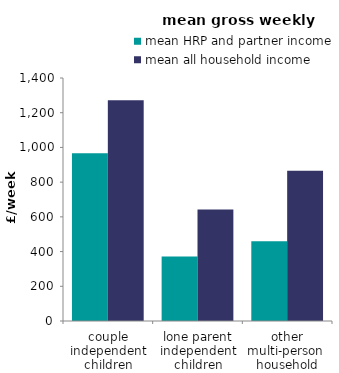
| Category | mean HRP and partner income  | mean all household income  |
|---|---|---|
| couple independent children | 966.702 | 1271.963 |
| lone parent independent children | 371.247 | 642.286 |
| other multi-person  household | 459.765 | 865.414 |